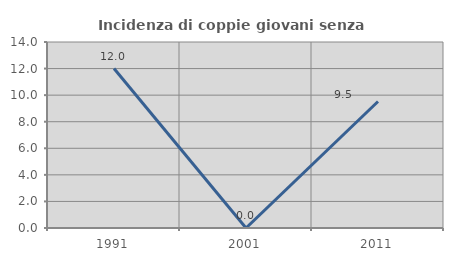
| Category | Incidenza di coppie giovani senza figli |
|---|---|
| 1991.0 | 12 |
| 2001.0 | 0 |
| 2011.0 | 9.524 |